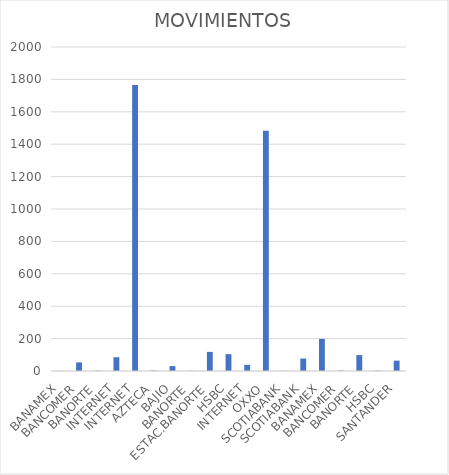
| Category | MOVIMIENTOS |
|---|---|
| BANAMEX | 1 |
| BANCOMER | 53 |
| BANORTE | 2 |
| INTERNET | 85 |
| INTERNET | 1765 |
| AZTECA | 3 |
| BAJIO | 30 |
| BANORTE | 1 |
| ESTAC.BANORTE | 118 |
| HSBC | 104 |
| INTERNET | 38 |
| OXXO | 1483 |
| SCOTIABANK | 1 |
| SCOTIABANK | 77 |
| BANAMEX | 198 |
| BANCOMER | 3 |
| BANORTE | 98 |
| HSBC | 2 |
| SANTANDER | 64 |